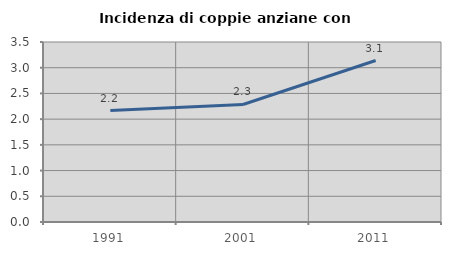
| Category | Incidenza di coppie anziane con figli |
|---|---|
| 1991.0 | 2.167 |
| 2001.0 | 2.285 |
| 2011.0 | 3.14 |